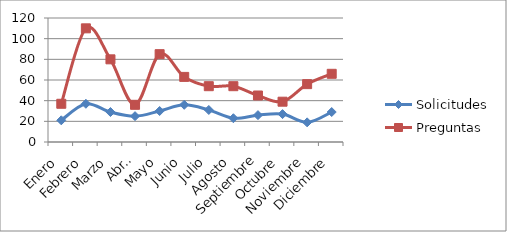
| Category | Solicitudes | Preguntas |
|---|---|---|
| Enero | 21 | 37 |
| Febrero | 37 | 110 |
| Marzo | 29 | 80 |
| Abril | 25 | 36 |
| Mayo | 30 | 85 |
| Junio | 36 | 63 |
| Julio | 31 | 54 |
| Agosto | 23 | 54 |
| Septiembre | 26 | 45 |
| Octubre | 27 | 39 |
| Noviembre | 19 | 56 |
| Diciembre | 29 | 66 |